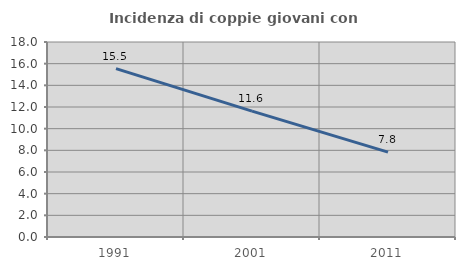
| Category | Incidenza di coppie giovani con figli |
|---|---|
| 1991.0 | 15.54 |
| 2001.0 | 11.615 |
| 2011.0 | 7.84 |